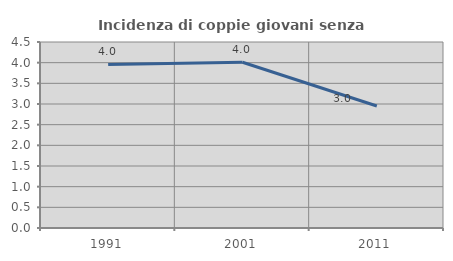
| Category | Incidenza di coppie giovani senza figli |
|---|---|
| 1991.0 | 3.958 |
| 2001.0 | 4.01 |
| 2011.0 | 2.952 |